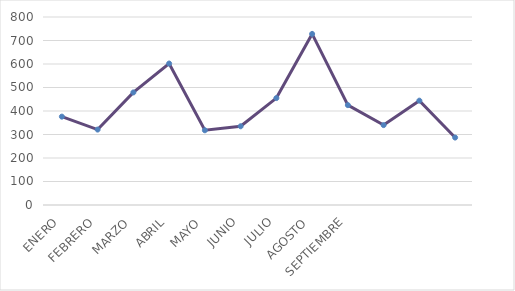
| Category | Series 0 |
|---|---|
| ENERO | 376 |
| FEBRERO | 321 |
| MARZO | 479 |
| ABRIL | 602 |
| MAYO | 318 |
| JUNIO | 335 |
| JULIO | 455 |
| AGOSTO | 728 |
| SEPTIEMBRE | 425 |